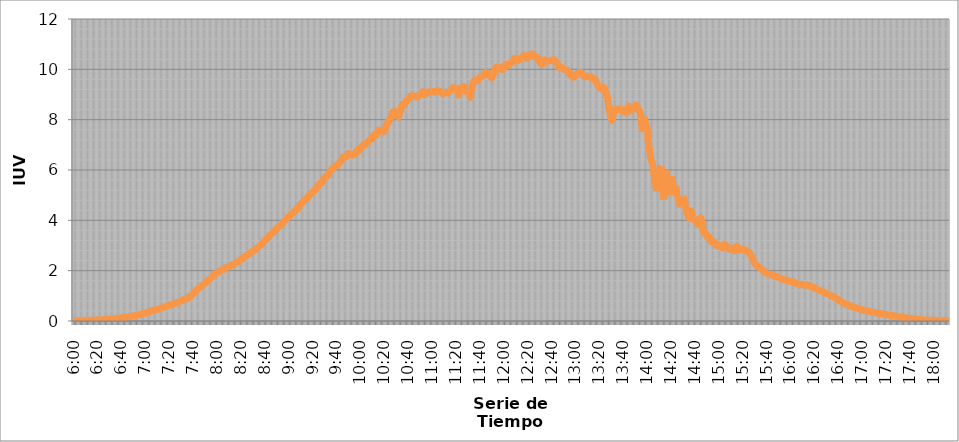
| Category | Series 0 |
|---|---|
| 0.25 | 0.014 |
| 0.25069444444444444 | 0.014 |
| 0.2513888888888889 | 0.014 |
| 0.2520833333333333 | 0.014 |
| 0.25277777777777777 | 0.014 |
| 0.2534722222222222 | 0.014 |
| 0.25416666666666665 | 0.014 |
| 0.2548611111111111 | 0.014 |
| 0.2555555555555556 | 0.014 |
| 0.25625000000000003 | 0.014 |
| 0.2569444444444445 | 0.014 |
| 0.2576388888888889 | 0.014 |
| 0.25833333333333336 | 0.014 |
| 0.2590277777777778 | 0.028 |
| 0.25972222222222224 | 0.028 |
| 0.2604166666666667 | 0.028 |
| 0.2611111111111111 | 0.028 |
| 0.26180555555555557 | 0.028 |
| 0.2625 | 0.028 |
| 0.26319444444444445 | 0.042 |
| 0.2638888888888889 | 0.042 |
| 0.26458333333333334 | 0.042 |
| 0.2652777777777778 | 0.042 |
| 0.2659722222222222 | 0.042 |
| 0.26666666666666666 | 0.042 |
| 0.2673611111111111 | 0.056 |
| 0.26805555555555555 | 0.056 |
| 0.26875 | 0.056 |
| 0.26944444444444443 | 0.056 |
| 0.2701388888888889 | 0.07 |
| 0.2708333333333333 | 0.07 |
| 0.27152777777777776 | 0.07 |
| 0.2722222222222222 | 0.084 |
| 0.27291666666666664 | 0.084 |
| 0.2736111111111111 | 0.084 |
| 0.2743055555555555 | 0.098 |
| 0.27499999999999997 | 0.098 |
| 0.27569444444444446 | 0.098 |
| 0.27638888888888885 | 0.112 |
| 0.27708333333333335 | 0.112 |
| 0.2777777777777778 | 0.126 |
| 0.27847222222222223 | 0.126 |
| 0.2791666666666667 | 0.14 |
| 0.2798611111111111 | 0.14 |
| 0.28055555555555556 | 0.154 |
| 0.28125 | 0.154 |
| 0.28194444444444444 | 0.168 |
| 0.2826388888888889 | 0.168 |
| 0.2833333333333333 | 0.182 |
| 0.28402777777777777 | 0.196 |
| 0.2847222222222222 | 0.196 |
| 0.28541666666666665 | 0.21 |
| 0.28611111111111115 | 0.224 |
| 0.28680555555555554 | 0.238 |
| 0.28750000000000003 | 0.238 |
| 0.2881944444444445 | 0.252 |
| 0.2888888888888889 | 0.266 |
| 0.28958333333333336 | 0.28 |
| 0.2902777777777778 | 0.294 |
| 0.29097222222222224 | 0.308 |
| 0.2916666666666667 | 0.322 |
| 0.2923611111111111 | 0.336 |
| 0.29305555555555557 | 0.35 |
| 0.29375 | 0.363 |
| 0.29444444444444445 | 0.377 |
| 0.2951388888888889 | 0.391 |
| 0.29583333333333334 | 0.405 |
| 0.2965277777777778 | 0.419 |
| 0.2972222222222222 | 0.433 |
| 0.29791666666666666 | 0.447 |
| 0.2986111111111111 | 0.461 |
| 0.29930555555555555 | 0.475 |
| 0.3 | 0.489 |
| 0.30069444444444443 | 0.503 |
| 0.3013888888888889 | 0.517 |
| 0.3020833333333333 | 0.545 |
| 0.30277777777777776 | 0.559 |
| 0.3034722222222222 | 0.573 |
| 0.30416666666666664 | 0.587 |
| 0.3048611111111111 | 0.601 |
| 0.3055555555555555 | 0.615 |
| 0.30624999999999997 | 0.643 |
| 0.3069444444444444 | 0.657 |
| 0.3076388888888889 | 0.671 |
| 0.30833333333333335 | 0.685 |
| 0.3090277777777778 | 0.699 |
| 0.30972222222222223 | 0.727 |
| 0.3104166666666667 | 0.741 |
| 0.3111111111111111 | 0.755 |
| 0.31180555555555556 | 0.783 |
| 0.3125 | 0.797 |
| 0.31319444444444444 | 0.811 |
| 0.3138888888888889 | 0.839 |
| 0.3145833333333333 | 0.853 |
| 0.31527777777777777 | 0.881 |
| 0.3159722222222222 | 0.895 |
| 0.31666666666666665 | 0.923 |
| 0.31736111111111115 | 0.951 |
| 0.31805555555555554 | 0.993 |
| 0.31875000000000003 | 1.035 |
| 0.3194444444444445 | 1.104 |
| 0.3201388888888889 | 1.16 |
| 0.32083333333333336 | 1.202 |
| 0.3215277777777778 | 1.23 |
| 0.32222222222222224 | 1.272 |
| 0.3229166666666667 | 1.314 |
| 0.3236111111111111 | 1.356 |
| 0.32430555555555557 | 1.398 |
| 0.325 | 1.426 |
| 0.32569444444444445 | 1.468 |
| 0.3263888888888889 | 1.51 |
| 0.32708333333333334 | 1.552 |
| 0.3277777777777778 | 1.594 |
| 0.3284722222222222 | 1.636 |
| 0.32916666666666666 | 1.678 |
| 0.3298611111111111 | 1.72 |
| 0.33055555555555555 | 1.761 |
| 0.33125 | 1.803 |
| 0.33194444444444443 | 1.845 |
| 0.3326388888888889 | 1.873 |
| 0.3333333333333333 | 1.915 |
| 0.3340277777777778 | 1.943 |
| 0.3347222222222222 | 1.971 |
| 0.3354166666666667 | 1.999 |
| 0.3361111111111111 | 2.027 |
| 0.3368055555555556 | 2.041 |
| 0.33749999999999997 | 2.055 |
| 0.33819444444444446 | 2.097 |
| 0.33888888888888885 | 2.125 |
| 0.33958333333333335 | 2.153 |
| 0.34027777777777773 | 2.167 |
| 0.34097222222222223 | 2.181 |
| 0.3416666666666666 | 2.209 |
| 0.3423611111111111 | 2.237 |
| 0.3430555555555555 | 2.251 |
| 0.34375 | 2.279 |
| 0.3444444444444445 | 2.307 |
| 0.3451388888888889 | 2.335 |
| 0.3458333333333334 | 2.363 |
| 0.34652777777777777 | 2.405 |
| 0.34722222222222227 | 2.446 |
| 0.34791666666666665 | 2.474 |
| 0.34861111111111115 | 2.502 |
| 0.34930555555555554 | 2.544 |
| 0.35000000000000003 | 2.572 |
| 0.3506944444444444 | 2.614 |
| 0.3513888888888889 | 2.656 |
| 0.3520833333333333 | 2.684 |
| 0.3527777777777778 | 2.712 |
| 0.3534722222222222 | 2.74 |
| 0.3541666666666667 | 2.768 |
| 0.3548611111111111 | 2.81 |
| 0.35555555555555557 | 2.838 |
| 0.35625 | 2.88 |
| 0.35694444444444445 | 2.908 |
| 0.3576388888888889 | 2.95 |
| 0.35833333333333334 | 2.992 |
| 0.3590277777777778 | 3.048 |
| 0.3597222222222222 | 3.09 |
| 0.36041666666666666 | 3.146 |
| 0.3611111111111111 | 3.187 |
| 0.36180555555555555 | 3.243 |
| 0.3625 | 3.285 |
| 0.36319444444444443 | 3.327 |
| 0.3638888888888889 | 3.383 |
| 0.3645833333333333 | 3.439 |
| 0.3652777777777778 | 3.481 |
| 0.3659722222222222 | 3.523 |
| 0.3666666666666667 | 3.565 |
| 0.3673611111111111 | 3.621 |
| 0.3680555555555556 | 3.663 |
| 0.36874999999999997 | 3.719 |
| 0.36944444444444446 | 3.761 |
| 0.37013888888888885 | 3.803 |
| 0.37083333333333335 | 3.831 |
| 0.37152777777777773 | 3.872 |
| 0.37222222222222223 | 3.942 |
| 0.3729166666666666 | 4.012 |
| 0.3736111111111111 | 4.054 |
| 0.3743055555555555 | 4.096 |
| 0.375 | 4.138 |
| 0.3756944444444445 | 4.166 |
| 0.3763888888888889 | 4.236 |
| 0.3770833333333334 | 4.278 |
| 0.37777777777777777 | 4.32 |
| 0.37847222222222227 | 4.362 |
| 0.37916666666666665 | 4.39 |
| 0.37986111111111115 | 4.474 |
| 0.38055555555555554 | 4.488 |
| 0.38125000000000003 | 4.544 |
| 0.3819444444444444 | 4.641 |
| 0.3826388888888889 | 4.697 |
| 0.3833333333333333 | 4.725 |
| 0.3840277777777778 | 4.795 |
| 0.3847222222222222 | 4.851 |
| 0.3854166666666667 | 4.851 |
| 0.3861111111111111 | 4.907 |
| 0.38680555555555557 | 4.991 |
| 0.3875 | 5.061 |
| 0.38819444444444445 | 5.075 |
| 0.3888888888888889 | 5.103 |
| 0.38958333333333334 | 5.159 |
| 0.3902777777777778 | 5.201 |
| 0.3909722222222222 | 5.27 |
| 0.39166666666666666 | 5.34 |
| 0.3923611111111111 | 5.396 |
| 0.39305555555555555 | 5.438 |
| 0.39375 | 5.494 |
| 0.39444444444444443 | 5.508 |
| 0.3951388888888889 | 5.634 |
| 0.3958333333333333 | 5.704 |
| 0.3965277777777778 | 5.746 |
| 0.3972222222222222 | 5.746 |
| 0.3979166666666667 | 5.802 |
| 0.3986111111111111 | 5.886 |
| 0.3993055555555556 | 5.955 |
| 0.39999999999999997 | 6.011 |
| 0.40069444444444446 | 6.067 |
| 0.40138888888888885 | 6.123 |
| 0.40208333333333335 | 6.151 |
| 0.40277777777777773 | 6.165 |
| 0.40347222222222223 | 6.207 |
| 0.4041666666666666 | 6.263 |
| 0.4048611111111111 | 6.319 |
| 0.4055555555555555 | 6.375 |
| 0.40625 | 6.473 |
| 0.4069444444444445 | 6.529 |
| 0.4076388888888889 | 6.543 |
| 0.4083333333333334 | 6.529 |
| 0.40902777777777777 | 6.585 |
| 0.40972222222222227 | 6.654 |
| 0.41041666666666665 | 6.627 |
| 0.41111111111111115 | 6.627 |
| 0.41180555555555554 | 6.585 |
| 0.41250000000000003 | 6.627 |
| 0.4131944444444444 | 6.64 |
| 0.4138888888888889 | 6.64 |
| 0.4145833333333333 | 6.752 |
| 0.4152777777777778 | 6.822 |
| 0.4159722222222222 | 6.766 |
| 0.4166666666666667 | 6.878 |
| 0.4173611111111111 | 6.906 |
| 0.41805555555555557 | 6.948 |
| 0.41875 | 7.032 |
| 0.41944444444444445 | 7.004 |
| 0.4201388888888889 | 7.074 |
| 0.42083333333333334 | 7.102 |
| 0.4215277777777778 | 7.144 |
| 0.4222222222222222 | 7.2 |
| 0.42291666666666666 | 7.284 |
| 0.4236111111111111 | 7.256 |
| 0.42430555555555555 | 7.326 |
| 0.425 | 7.395 |
| 0.42569444444444443 | 7.381 |
| 0.4263888888888889 | 7.479 |
| 0.4270833333333333 | 7.577 |
| 0.4277777777777778 | 7.563 |
| 0.4284722222222222 | 7.549 |
| 0.4291666666666667 | 7.563 |
| 0.4298611111111111 | 7.507 |
| 0.4305555555555556 | 7.535 |
| 0.43124999999999997 | 7.661 |
| 0.43194444444444446 | 7.829 |
| 0.43263888888888885 | 7.857 |
| 0.43333333333333335 | 7.955 |
| 0.43402777777777773 | 8.011 |
| 0.43472222222222223 | 8.136 |
| 0.4354166666666666 | 8.262 |
| 0.4361111111111111 | 8.332 |
| 0.4368055555555555 | 8.318 |
| 0.4375 | 8.22 |
| 0.4381944444444445 | 8.206 |
| 0.4388888888888889 | 8.108 |
| 0.4395833333333334 | 8.318 |
| 0.44027777777777777 | 8.402 |
| 0.44097222222222227 | 8.584 |
| 0.44166666666666665 | 8.612 |
| 0.44236111111111115 | 8.612 |
| 0.44305555555555554 | 8.71 |
| 0.44375000000000003 | 8.765 |
| 0.4444444444444444 | 8.807 |
| 0.4451388888888889 | 8.863 |
| 0.4458333333333333 | 8.933 |
| 0.4465277777777778 | 8.933 |
| 0.4472222222222222 | 8.947 |
| 0.4479166666666667 | 8.933 |
| 0.4486111111111111 | 8.933 |
| 0.44930555555555557 | 8.905 |
| 0.45 | 8.905 |
| 0.45069444444444445 | 8.975 |
| 0.4513888888888889 | 9.017 |
| 0.45208333333333334 | 9.003 |
| 0.4527777777777778 | 9.101 |
| 0.4534722222222222 | 9.101 |
| 0.45416666666666666 | 9.003 |
| 0.4548611111111111 | 9.031 |
| 0.45555555555555555 | 9.059 |
| 0.45625 | 9.087 |
| 0.45694444444444443 | 9.101 |
| 0.4576388888888889 | 9.115 |
| 0.4583333333333333 | 9.115 |
| 0.4590277777777778 | 9.115 |
| 0.4597222222222222 | 9.087 |
| 0.4604166666666667 | 9.101 |
| 0.4611111111111111 | 9.143 |
| 0.4618055555555556 | 9.157 |
| 0.46249999999999997 | 9.143 |
| 0.46319444444444446 | 9.115 |
| 0.46388888888888885 | 9.073 |
| 0.46458333333333335 | 9.031 |
| 0.46527777777777773 | 9.059 |
| 0.46597222222222223 | 9.087 |
| 0.4666666666666666 | 9.073 |
| 0.4673611111111111 | 9.087 |
| 0.4680555555555555 | 9.073 |
| 0.46875 | 9.157 |
| 0.4694444444444445 | 9.185 |
| 0.4701388888888889 | 9.227 |
| 0.4708333333333334 | 9.283 |
| 0.47152777777777777 | 9.227 |
| 0.47222222222222227 | 9.241 |
| 0.47291666666666665 | 9.199 |
| 0.47361111111111115 | 8.975 |
| 0.47430555555555554 | 9.143 |
| 0.47500000000000003 | 9.255 |
| 0.4756944444444444 | 9.283 |
| 0.4763888888888889 | 9.311 |
| 0.4770833333333333 | 9.297 |
| 0.4777777777777778 | 9.129 |
| 0.4784722222222222 | 9.171 |
| 0.4791666666666667 | 9.087 |
| 0.4798611111111111 | 9.073 |
| 0.48055555555555557 | 8.891 |
| 0.48125 | 9.213 |
| 0.48194444444444445 | 9.381 |
| 0.4826388888888889 | 9.52 |
| 0.48333333333333334 | 9.576 |
| 0.4840277777777778 | 9.534 |
| 0.4847222222222222 | 9.562 |
| 0.48541666666666666 | 9.59 |
| 0.4861111111111111 | 9.674 |
| 0.48680555555555555 | 9.716 |
| 0.4875 | 9.73 |
| 0.48819444444444443 | 9.772 |
| 0.4888888888888889 | 9.842 |
| 0.4895833333333333 | 9.87 |
| 0.4902777777777778 | 9.786 |
| 0.4909722222222222 | 9.842 |
| 0.4916666666666667 | 9.828 |
| 0.4923611111111111 | 9.73 |
| 0.4930555555555556 | 9.66 |
| 0.49374999999999997 | 9.786 |
| 0.49444444444444446 | 9.856 |
| 0.49513888888888885 | 10.01 |
| 0.49583333333333335 | 10.094 |
| 0.49652777777777773 | 10.024 |
| 0.49722222222222223 | 10.024 |
| 0.4979166666666666 | 10.052 |
| 0.4986111111111111 | 10.066 |
| 0.4993055555555555 | 9.982 |
| 0.5 | 10.08 |
| 0.5006944444444444 | 10.177 |
| 0.5013888888888889 | 10.149 |
| 0.5020833333333333 | 10.136 |
| 0.5027777777777778 | 10.149 |
| 0.5034722222222222 | 10.233 |
| 0.5041666666666667 | 10.261 |
| 0.5048611111111111 | 10.317 |
| 0.5055555555555555 | 10.303 |
| 0.50625 | 10.429 |
| 0.5069444444444444 | 10.443 |
| 0.5076388888888889 | 10.429 |
| 0.5083333333333333 | 10.359 |
| 0.5090277777777777 | 10.401 |
| 0.5097222222222222 | 10.401 |
| 0.5104166666666666 | 10.457 |
| 0.5111111111111112 | 10.513 |
| 0.5118055555555555 | 10.555 |
| 0.5125000000000001 | 10.541 |
| 0.5131944444444444 | 10.443 |
| 0.513888888888889 | 10.457 |
| 0.5145833333333333 | 10.555 |
| 0.5152777777777778 | 10.569 |
| 0.5159722222222222 | 10.583 |
| 0.5166666666666667 | 10.611 |
| 0.517361111111111 | 10.513 |
| 0.5180555555555556 | 10.513 |
| 0.5187499999999999 | 10.471 |
| 0.5194444444444445 | 10.485 |
| 0.5201388888888888 | 10.443 |
| 0.5208333333333334 | 10.303 |
| 0.5215277777777778 | 10.233 |
| 0.5222222222222223 | 10.191 |
| 0.5229166666666667 | 10.247 |
| 0.5236111111111111 | 10.317 |
| 0.5243055555555556 | 10.373 |
| 0.525 | 10.345 |
| 0.5256944444444445 | 10.317 |
| 0.5263888888888889 | 10.345 |
| 0.5270833333333333 | 10.345 |
| 0.5277777777777778 | 10.359 |
| 0.5284722222222222 | 10.373 |
| 0.5291666666666667 | 10.387 |
| 0.5298611111111111 | 10.317 |
| 0.5305555555555556 | 10.233 |
| 0.53125 | 10.219 |
| 0.5319444444444444 | 10.108 |
| 0.5326388888888889 | 10.066 |
| 0.5333333333333333 | 10.066 |
| 0.5340277777777778 | 10.066 |
| 0.5347222222222222 | 10.024 |
| 0.5354166666666667 | 9.982 |
| 0.5361111111111111 | 9.982 |
| 0.5368055555555555 | 9.968 |
| 0.5375 | 9.912 |
| 0.5381944444444444 | 9.828 |
| 0.5388888888888889 | 9.758 |
| 0.5395833333333333 | 9.758 |
| 0.5402777777777777 | 9.688 |
| 0.5409722222222222 | 9.702 |
| 0.5416666666666666 | 9.758 |
| 0.5423611111111112 | 9.814 |
| 0.5430555555555555 | 9.828 |
| 0.5437500000000001 | 9.87 |
| 0.5444444444444444 | 9.87 |
| 0.545138888888889 | 9.87 |
| 0.5458333333333333 | 9.814 |
| 0.5465277777777778 | 9.73 |
| 0.5472222222222222 | 9.702 |
| 0.5479166666666667 | 9.716 |
| 0.548611111111111 | 9.73 |
| 0.5493055555555556 | 9.702 |
| 0.5499999999999999 | 9.702 |
| 0.5506944444444445 | 9.702 |
| 0.5513888888888888 | 9.646 |
| 0.5520833333333334 | 9.604 |
| 0.5527777777777778 | 9.632 |
| 0.5534722222222223 | 9.534 |
| 0.5541666666666667 | 9.436 |
| 0.5548611111111111 | 9.311 |
| 0.5555555555555556 | 9.297 |
| 0.55625 | 9.269 |
| 0.5569444444444445 | 9.199 |
| 0.5576388888888889 | 9.283 |
| 0.5583333333333333 | 9.255 |
| 0.5590277777777778 | 9.143 |
| 0.5597222222222222 | 9.003 |
| 0.5604166666666667 | 8.835 |
| 0.5611111111111111 | 8.43 |
| 0.5618055555555556 | 8.248 |
| 0.5625 | 7.983 |
| 0.5631944444444444 | 8.052 |
| 0.5638888888888889 | 8.332 |
| 0.5645833333333333 | 8.416 |
| 0.5652777777777778 | 8.402 |
| 0.5659722222222222 | 8.416 |
| 0.5666666666666667 | 8.402 |
| 0.5673611111111111 | 8.416 |
| 0.5680555555555555 | 8.416 |
| 0.56875 | 8.374 |
| 0.5694444444444444 | 8.318 |
| 0.5701388888888889 | 8.374 |
| 0.5708333333333333 | 8.318 |
| 0.5715277777777777 | 8.276 |
| 0.5722222222222222 | 8.486 |
| 0.5729166666666666 | 8.528 |
| 0.5736111111111112 | 8.388 |
| 0.5743055555555555 | 8.388 |
| 0.5750000000000001 | 8.444 |
| 0.5756944444444444 | 8.5 |
| 0.576388888888889 | 8.528 |
| 0.5770833333333333 | 8.584 |
| 0.5777777777777778 | 8.5 |
| 0.5784722222222222 | 8.374 |
| 0.5791666666666667 | 8.29 |
| 0.579861111111111 | 8.052 |
| 0.5805555555555556 | 7.521 |
| 0.5812499999999999 | 8.122 |
| 0.5819444444444445 | 7.969 |
| 0.5826388888888888 | 7.787 |
| 0.5833333333333334 | 7.661 |
| 0.5840277777777778 | 7.102 |
| 0.5847222222222223 | 6.808 |
| 0.5854166666666667 | 6.473 |
| 0.5861111111111111 | 6.347 |
| 0.5868055555555556 | 6.067 |
| 0.5875 | 5.718 |
| 0.5881944444444445 | 5.424 |
| 0.5888888888888889 | 5.159 |
| 0.5895833333333333 | 5.69 |
| 0.5902777777777778 | 5.788 |
| 0.5909722222222222 | 6.067 |
| 0.5916666666666667 | 6.137 |
| 0.5923611111111111 | 5.368 |
| 0.5930555555555556 | 4.823 |
| 0.59375 | 5.382 |
| 0.5944444444444444 | 5.983 |
| 0.5951388888888889 | 5.508 |
| 0.5958333333333333 | 5.201 |
| 0.5965277777777778 | 5.019 |
| 0.5972222222222222 | 5.494 |
| 0.5979166666666667 | 5.746 |
| 0.5986111111111111 | 5.145 |
| 0.5993055555555555 | 5.103 |
| 0.6 | 5.368 |
| 0.6006944444444444 | 4.935 |
| 0.6013888888888889 | 4.865 |
| 0.6020833333333333 | 4.655 |
| 0.6027777777777777 | 4.739 |
| 0.6034722222222222 | 4.53 |
| 0.6041666666666666 | 4.935 |
| 0.6048611111111112 | 4.851 |
| 0.6055555555555555 | 4.599 |
| 0.6062500000000001 | 4.362 |
| 0.6069444444444444 | 4.222 |
| 0.607638888888889 | 4.096 |
| 0.6083333333333333 | 4.264 |
| 0.6090277777777778 | 4.362 |
| 0.6097222222222222 | 4.054 |
| 0.6104166666666667 | 4.054 |
| 0.611111111111111 | 4.04 |
| 0.6118055555555556 | 3.956 |
| 0.6124999999999999 | 3.872 |
| 0.6131944444444445 | 3.831 |
| 0.6138888888888888 | 3.956 |
| 0.6145833333333334 | 4.096 |
| 0.6152777777777778 | 3.928 |
| 0.6159722222222223 | 3.551 |
| 0.6166666666666667 | 3.509 |
| 0.6173611111111111 | 3.481 |
| 0.6180555555555556 | 3.369 |
| 0.61875 | 3.313 |
| 0.6194444444444445 | 3.327 |
| 0.6201388888888889 | 3.201 |
| 0.6208333333333333 | 3.132 |
| 0.6215277777777778 | 3.159 |
| 0.6222222222222222 | 3.146 |
| 0.6229166666666667 | 3.118 |
| 0.6236111111111111 | 3.048 |
| 0.6243055555555556 | 2.978 |
| 0.625 | 2.964 |
| 0.6256944444444444 | 2.978 |
| 0.6263888888888889 | 2.936 |
| 0.6270833333333333 | 2.908 |
| 0.6277777777777778 | 2.992 |
| 0.6284722222222222 | 3.062 |
| 0.6291666666666667 | 3.006 |
| 0.6298611111111111 | 2.95 |
| 0.6305555555555555 | 2.88 |
| 0.63125 | 2.852 |
| 0.6319444444444444 | 2.894 |
| 0.6326388888888889 | 2.88 |
| 0.6333333333333333 | 2.824 |
| 0.6340277777777777 | 2.796 |
| 0.6347222222222222 | 2.908 |
| 0.6354166666666666 | 2.978 |
| 0.6361111111111112 | 2.922 |
| 0.6368055555555555 | 2.824 |
| 0.6375000000000001 | 2.824 |
| 0.6381944444444444 | 2.824 |
| 0.638888888888889 | 2.852 |
| 0.6395833333333333 | 2.838 |
| 0.6402777777777778 | 2.824 |
| 0.6409722222222222 | 2.782 |
| 0.6416666666666667 | 2.754 |
| 0.642361111111111 | 2.74 |
| 0.6430555555555556 | 2.684 |
| 0.6437499999999999 | 2.586 |
| 0.6444444444444445 | 2.502 |
| 0.6451388888888888 | 2.377 |
| 0.6458333333333334 | 2.293 |
| 0.6465277777777778 | 2.237 |
| 0.6472222222222223 | 2.195 |
| 0.6479166666666667 | 2.153 |
| 0.6486111111111111 | 2.111 |
| 0.6493055555555556 | 2.083 |
| 0.65 | 2.041 |
| 0.6506944444444445 | 2.013 |
| 0.6513888888888889 | 1.971 |
| 0.6520833333333333 | 1.929 |
| 0.6527777777777778 | 1.901 |
| 0.6534722222222222 | 1.873 |
| 0.6541666666666667 | 1.859 |
| 0.6548611111111111 | 1.845 |
| 0.6555555555555556 | 1.831 |
| 0.65625 | 1.817 |
| 0.6569444444444444 | 1.803 |
| 0.6576388888888889 | 1.775 |
| 0.6583333333333333 | 1.761 |
| 0.6590277777777778 | 1.748 |
| 0.6597222222222222 | 1.734 |
| 0.6604166666666667 | 1.72 |
| 0.6611111111111111 | 1.692 |
| 0.6618055555555555 | 1.664 |
| 0.6625 | 1.65 |
| 0.6631944444444444 | 1.636 |
| 0.6638888888888889 | 1.622 |
| 0.6645833333333333 | 1.594 |
| 0.6652777777777777 | 1.594 |
| 0.6659722222222222 | 1.58 |
| 0.6666666666666666 | 1.566 |
| 0.6673611111111111 | 1.566 |
| 0.6680555555555556 | 1.552 |
| 0.6687500000000001 | 1.538 |
| 0.6694444444444444 | 1.51 |
| 0.6701388888888888 | 1.496 |
| 0.6708333333333334 | 1.482 |
| 0.6715277777777778 | 1.468 |
| 0.6722222222222222 | 1.454 |
| 0.6729166666666666 | 1.44 |
| 0.6736111111111112 | 1.44 |
| 0.6743055555555556 | 1.44 |
| 0.6749999999999999 | 1.426 |
| 0.6756944444444444 | 1.426 |
| 0.6763888888888889 | 1.426 |
| 0.6770833333333334 | 1.412 |
| 0.6777777777777777 | 1.398 |
| 0.6784722222222223 | 1.37 |
| 0.6791666666666667 | 1.356 |
| 0.6798611111111111 | 1.328 |
| 0.6805555555555555 | 1.314 |
| 0.68125 | 1.286 |
| 0.6819444444444445 | 1.258 |
| 0.6826388888888889 | 1.244 |
| 0.6833333333333332 | 1.23 |
| 0.6840277777777778 | 1.202 |
| 0.6847222222222222 | 1.188 |
| 0.6854166666666667 | 1.16 |
| 0.686111111111111 | 1.146 |
| 0.6868055555555556 | 1.118 |
| 0.6875 | 1.104 |
| 0.6881944444444444 | 1.076 |
| 0.688888888888889 | 1.062 |
| 0.6895833333333333 | 1.035 |
| 0.6902777777777778 | 1.007 |
| 0.6909722222222222 | 0.979 |
| 0.6916666666666668 | 0.951 |
| 0.6923611111111111 | 0.937 |
| 0.6930555555555555 | 0.909 |
| 0.69375 | 0.867 |
| 0.6944444444444445 | 0.839 |
| 0.6951388888888889 | 0.811 |
| 0.6958333333333333 | 0.783 |
| 0.6965277777777777 | 0.755 |
| 0.6972222222222223 | 0.727 |
| 0.6979166666666666 | 0.699 |
| 0.6986111111111111 | 0.685 |
| 0.6993055555555556 | 0.657 |
| 0.7000000000000001 | 0.643 |
| 0.7006944444444444 | 0.615 |
| 0.7013888888888888 | 0.601 |
| 0.7020833333333334 | 0.587 |
| 0.7027777777777778 | 0.559 |
| 0.7034722222222222 | 0.545 |
| 0.7041666666666666 | 0.531 |
| 0.7048611111111112 | 0.517 |
| 0.7055555555555556 | 0.503 |
| 0.7062499999999999 | 0.489 |
| 0.7069444444444444 | 0.475 |
| 0.7076388888888889 | 0.461 |
| 0.7083333333333334 | 0.447 |
| 0.7090277777777777 | 0.433 |
| 0.7097222222222223 | 0.419 |
| 0.7104166666666667 | 0.405 |
| 0.7111111111111111 | 0.405 |
| 0.7118055555555555 | 0.391 |
| 0.7125 | 0.377 |
| 0.7131944444444445 | 0.363 |
| 0.7138888888888889 | 0.363 |
| 0.7145833333333332 | 0.35 |
| 0.7152777777777778 | 0.336 |
| 0.7159722222222222 | 0.336 |
| 0.7166666666666667 | 0.322 |
| 0.717361111111111 | 0.308 |
| 0.7180555555555556 | 0.308 |
| 0.71875 | 0.294 |
| 0.7194444444444444 | 0.294 |
| 0.720138888888889 | 0.28 |
| 0.7208333333333333 | 0.266 |
| 0.7215277777777778 | 0.266 |
| 0.7222222222222222 | 0.252 |
| 0.7229166666666668 | 0.252 |
| 0.7236111111111111 | 0.238 |
| 0.7243055555555555 | 0.224 |
| 0.725 | 0.224 |
| 0.7256944444444445 | 0.21 |
| 0.7263888888888889 | 0.21 |
| 0.7270833333333333 | 0.196 |
| 0.7277777777777777 | 0.196 |
| 0.7284722222222223 | 0.182 |
| 0.7291666666666666 | 0.168 |
| 0.7298611111111111 | 0.168 |
| 0.7305555555555556 | 0.154 |
| 0.7312500000000001 | 0.154 |
| 0.7319444444444444 | 0.14 |
| 0.7326388888888888 | 0.14 |
| 0.7333333333333334 | 0.126 |
| 0.7340277777777778 | 0.126 |
| 0.7347222222222222 | 0.112 |
| 0.7354166666666666 | 0.112 |
| 0.7361111111111112 | 0.098 |
| 0.7368055555555556 | 0.098 |
| 0.7374999999999999 | 0.084 |
| 0.7381944444444444 | 0.084 |
| 0.7388888888888889 | 0.07 |
| 0.7395833333333334 | 0.07 |
| 0.7402777777777777 | 0.07 |
| 0.7409722222222223 | 0.056 |
| 0.7416666666666667 | 0.056 |
| 0.7423611111111111 | 0.056 |
| 0.7430555555555555 | 0.042 |
| 0.74375 | 0.042 |
| 0.7444444444444445 | 0.042 |
| 0.7451388888888889 | 0.042 |
| 0.7458333333333332 | 0.042 |
| 0.7465277777777778 | 0.028 |
| 0.7472222222222222 | 0.028 |
| 0.7479166666666667 | 0.028 |
| 0.748611111111111 | 0.028 |
| 0.7493055555555556 | 0.028 |
| 0.75 | 0.028 |
| 0.7506944444444444 | 0.028 |
| 0.751388888888889 | 0.014 |
| 0.7520833333333333 | 0.014 |
| 0.7527777777777778 | 0.014 |
| 0.7534722222222222 | 0.014 |
| 0.7541666666666668 | 0.014 |
| 0.7548611111111111 | 0.014 |
| 0.7555555555555555 | 0.014 |
| 0.75625 | 0.014 |
| 0.7569444444444445 | 0.014 |
| 0.7576388888888889 | 0.014 |
| 0.7583333333333333 | 0.014 |
| 0.7590277777777777 | 0.014 |